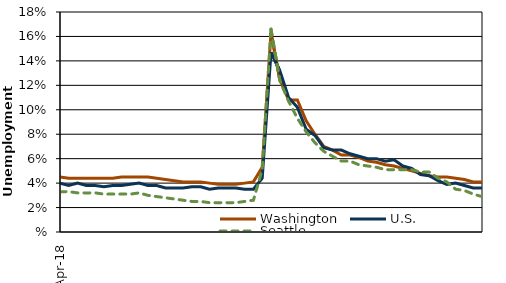
| Category | Washington | U.S. | Seattle |
|---|---|---|---|
| 2018-04-01 | 4.5 | 4 | 3.3 |
| 2018-05-01 | 4.4 | 3.8 | 3.3 |
| 2018-06-01 | 4.4 | 4 | 3.2 |
| 2018-07-01 | 4.4 | 3.8 | 3.2 |
| 2018-08-01 | 4.4 | 3.8 | 3.2 |
| 2018-09-01 | 4.4 | 3.7 | 3.1 |
| 2018-10-01 | 4.4 | 3.8 | 3.1 |
| 2018-11-01 | 4.5 | 3.8 | 3.1 |
| 2018-12-01 | 4.5 | 3.9 | 3.1 |
| 2019-01-01 | 4.5 | 4 | 3.2 |
| 2019-02-01 | 4.5 | 3.8 | 3 |
| 2019-03-01 | 4.4 | 3.8 | 2.9 |
| 2019-04-01 | 4.3 | 3.6 | 2.8 |
| 2019-05-01 | 4.2 | 3.6 | 2.7 |
| 2019-06-01 | 4.1 | 3.6 | 2.6 |
| 2019-07-01 | 4.1 | 3.7 | 2.5 |
| 2019-08-01 | 4.1 | 3.7 | 2.5 |
| 2019-09-01 | 4 | 3.5 | 2.4 |
| 2019-10-01 | 3.9 | 3.6 | 2.4 |
| 2019-11-01 | 3.9 | 3.6 | 2.4 |
| 2019-12-01 | 3.9 | 3.6 | 2.4 |
| 2020-01-01 | 4 | 3.5 | 2.5 |
| 2020-02-01 | 4.1 | 3.5 | 2.6 |
| 2020-03-01 | 5.3 | 4.4 | 5.1 |
| 2020-04-01 | 16.3 | 14.7 | 16.6 |
| 2020-05-01 | 12.5 | 13.2 | 12.4 |
| 2020-06-01 | 10.8 | 11 | 10.7 |
| 2020-07-01 | 10.8 | 10.2 | 9.3 |
| 2020-08-01 | 9.1 | 8.4 | 8.2 |
| 2020-09-01 | 8 | 7.9 | 7.3 |
| 2020-10-01 | 7 | 6.9 | 6.6 |
| 2020-11-01 | 6.7 | 6.7 | 6.2 |
| 2020-12-01 | 6.3 | 6.7 | 5.8 |
| 2021-01-01 | 6.3 | 6.4 | 5.8 |
| 2021-02-01 | 6.1 | 6.2 | 5.5 |
| 2021-03-01 | 5.8 | 6 | 5.4 |
| 2021-04-01 | 5.7 | 6 | 5.3 |
| 2021-05-01 | 5.5 | 5.8 | 5.1 |
| 2021-06-01 | 5.4 | 5.9 | 5.1 |
| 2021-07-01 | 5.2 | 5.4 | 5.1 |
| 2021-08-01 | 5 | 5.2 | 5.1 |
| 2021-09-01 | 4.8 | 4.7 | 4.9 |
| 2021-10-01 | 4.6 | 4.6 | 4.9 |
| 2021-11-01 | 4.5 | 4.2 | 4.4 |
| 2021-12-01 | 4.5 | 3.9 | 4.1 |
| 2022-01-01 | 4.4 | 4 | 3.5 |
| 2022-02-01 | 4.3 | 3.8 | 3.4 |
| 2022-03-01 | 4.1 | 3.6 | 3.1 |
| 2022-04-01 | 4.1 | 3.6 | 2.9 |